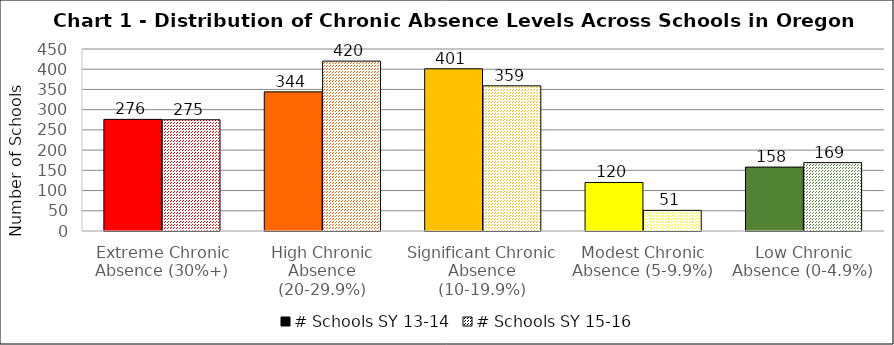
| Category | # Schools SY 13-14 | # Schools SY 15-16 |
|---|---|---|
| Extreme Chronic Absence (30%+) | 276 | 275 |
| High Chronic Absence (20-29.9%) | 344 | 420 |
| Significant Chronic Absence (10-19.9%) | 401 | 359 |
| Modest Chronic Absence (5-9.9%) | 120 | 51 |
| Low Chronic Absence (0-4.9%) | 158 | 169 |